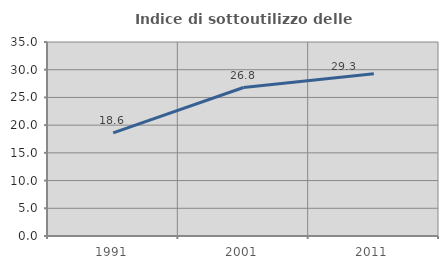
| Category | Indice di sottoutilizzo delle abitazioni  |
|---|---|
| 1991.0 | 18.599 |
| 2001.0 | 26.79 |
| 2011.0 | 29.285 |